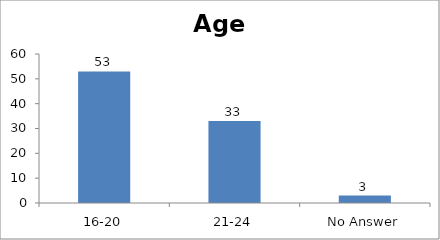
| Category | Age |
|---|---|
| 16-20 | 53 |
| 21-24 | 33 |
| No Answer | 3 |